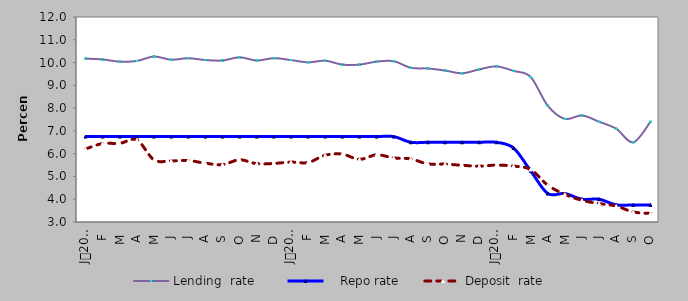
| Category | Lending  rate |    Repo rate | Deposit  rate |
|---|---|---|---|
| 0 | 10.174 | 6.75 | 6.207 |
| 1900-01-01 | 10.136 | 6.75 | 6.446 |
| 1900-01-02 | 10.04 | 6.75 | 6.45 |
| 1900-01-03 | 10.07 | 6.75 | 6.6 |
| 1900-01-04 | 10.265 | 6.75 | 5.728 |
| 1900-01-05 | 10.125 | 6.75 | 5.682 |
| 1900-01-06 | 10.19 | 6.75 | 5.7 |
| 1900-01-07 | 10.11 | 6.75 | 5.58 |
| 1900-01-08 | 10.09 | 6.75 | 5.52 |
| 1900-01-09 | 10.23 | 6.75 | 5.73 |
| 1900-01-10 | 10.09 | 6.75 | 5.56 |
| 1900-01-11 | 10.192 | 6.75 | 5.572 |
| 1900-01-12 | 10.11 | 6.75 | 5.63 |
| 1900-01-13 | 10.01 | 6.75 | 5.61 |
| 1900-01-14 | 10.08 | 6.75 | 5.93 |
| 1900-01-15 | 9.91 | 6.75 | 5.98 |
| 1900-01-16 | 9.91 | 6.75 | 5.75 |
| 1900-01-17 | 10.04 | 6.75 | 5.95 |
| 1900-01-18 | 10.06 | 6.75 | 5.813 |
| 1900-01-19 | 9.77 | 6.5 | 5.77 |
| 1900-01-20 | 9.74 | 6.5 | 5.55 |
| 1900-01-21 | 9.65 | 6.5 | 5.54 |
| 1900-01-22 | 9.53 | 6.5 | 5.49 |
| 1900-01-23 | 9.7 | 6.5 | 5.45 |
| 1900-01-24 | 9.833 | 6.5 | 5.497 |
| 1900-01-25 | 9.634 | 6.25 | 5.454 |
| 1900-01-26 | 9.369 | 5.25 | 5.304 |
| 1900-01-27 | 8.106 | 4.25 | 4.617 |
| 1900-01-28 | 7.526 | 4.25 | 4.216 |
| 1900-01-29 | 7.679 | 4 | 3.952 |
| 1900-01-30 | 7.4 | 4 | 3.81 |
| 1900-01-31 | 7.095 | 3.75 | 3.699 |
| 1900-02-01 | 6.5 | 3.75 | 3.44 |
| 1900-02-02 | 7.402 | 3.75 | 3.374 |